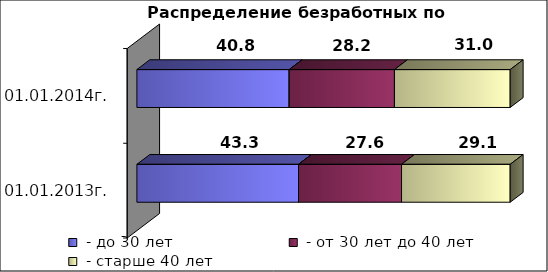
| Category |  - до 30 лет  |  - от 30 лет до 40 лет  |  - старше 40 лет  |
|---|---|---|---|
| на 01.01.2013г. | 43.3 | 27.6 | 29.1 |
| на 01.01.2014г. | 40.8 | 28.2 | 31 |